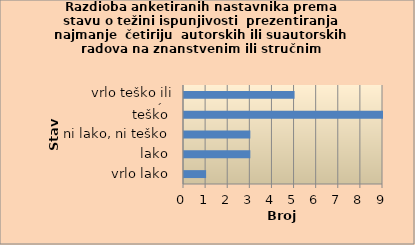
| Category | Series 0 |
|---|---|
| vrlo lako | 1 |
| lako | 3 |
| ni lako, ni teško | 3 |
| teško | 9 |
| vrlo teško ili nemoguće | 5 |